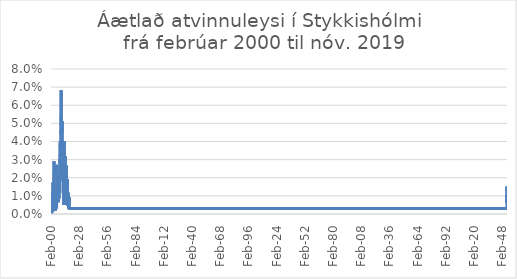
| Category | Áætlað atvinnuleysi |
|---|---|
| 2000-02-01 | 0.01 |
| 2000-03-01 | 0.01 |
| 2000-04-01 | 0.012 |
| 2000-05-01 | 0.003 |
| 2000-06-01 | 0.003 |
| 2000-07-01 | 0.001 |
| 2000-08-01 | 0.001 |
| 2000-09-01 | 0 |
| 2000-10-01 | 0 |
| 2000-11-01 | 0.001 |
| 2000-12-01 | 0.004 |
| 2001-01-01 | 0.003 |
| 2001-02-01 | 0.006 |
| 2001-03-01 | 0.004 |
| 2001-04-01 | 0.006 |
| 2001-05-01 | 0.004 |
| 2001-06-01 | 0.001 |
| 2001-07-01 | 0.003 |
| 2001-08-01 | 0.004 |
| 2001-09-01 | 0.003 |
| 2001-10-01 | 0.001 |
| 2001-11-01 | 0.006 |
| 2001-12-01 | 0.01 |
| 2002-01-01 | 0.017 |
| 2002-02-01 | 0.013 |
| 2002-03-01 | 0.012 |
| 2002-04-01 | 0.009 |
| 2002-05-01 | 0.006 |
| 2002-06-01 | 0.003 |
| 2002-07-01 | 0.003 |
| 2002-08-01 | 0.009 |
| 2002-09-01 | 0.01 |
| 2002-10-01 | 0.018 |
| 2002-11-01 | 0.019 |
| 2002-12-01 | 0.019 |
| 2003-01-01 | 0.026 |
| 2003-02-01 | 0.028 |
| 2003-03-01 | 0.029 |
| 2003-04-01 | 0.022 |
| 2003-05-01 | 0.016 |
| 2003-06-01 | 0.013 |
| 2003-07-01 | 0.005 |
| 2003-08-01 | 0.009 |
| 2003-09-01 | 0.006 |
| 2003-10-01 | 0.008 |
| 2003-11-01 | 0.003 |
| 2003-12-01 | 0.01 |
| 2004-01-01 | 0.015 |
| 2004-02-01 | 0.012 |
| 2004-03-01 | 0.012 |
| 2004-04-01 | 0.011 |
| 2004-05-01 | 0.007 |
| 2004-06-01 | 0.003 |
| 2004-07-01 | 0.002 |
| 2004-08-01 | 0.005 |
| 2004-09-01 | 0.005 |
| 2004-10-01 | 0.007 |
| 2004-11-01 | 0.003 |
| 2004-12-01 | 0.005 |
| 2005-01-01 | 0.007 |
| 2005-02-01 | 0.003 |
| 2005-03-01 | 0.007 |
| 2005-04-01 | 0.013 |
| 2005-05-01 | 0.007 |
| 2005-06-01 | 0.003 |
| 2005-07-01 | 0.005 |
| 2005-08-01 | 0.003 |
| 2005-09-01 | 0.005 |
| 2005-10-01 | 0.01 |
| 2005-11-01 | 0.013 |
| 2005-12-01 | 0.013 |
| 2006-01-01 | 0.027 |
| 2006-02-01 | 0.021 |
| 2006-03-01 | 0.019 |
| 2006-04-01 | 0.018 |
| 2006-05-01 | 0.011 |
| 2006-06-01 | 0.011 |
| 2006-07-01 | 0.011 |
| 2006-08-01 | 0.009 |
| 2006-09-01 | 0.011 |
| 2006-10-01 | 0.013 |
| 2006-11-01 | 0.01 |
| 2006-12-01 | 0.01 |
| 2007-01-01 | 0.011 |
| 2007-02-01 | 0.008 |
| 2007-03-01 | 0.008 |
| 2007-04-01 | 0.008 |
| 2007-05-01 | 0.008 |
| 2007-06-01 | 0.01 |
| 2007-07-01 | 0.008 |
| 2007-08-01 | 0.007 |
| 2007-09-01 | 0.01 |
| 2007-10-01 | 0.012 |
| 2007-11-01 | 0.012 |
| 2007-12-01 | 0.009 |
| 2008-01-01 | 0.01 |
| 2008-02-01 | 0.015 |
| 2008-03-01 | 0.012 |
| 2008-04-01 | 0.013 |
| 2008-05-01 | 0.014 |
| 2008-06-01 | 0.011 |
| 2008-07-01 | 0.015 |
| 2008-08-01 | 0.015 |
| 2008-09-01 | 0.011 |
| 2008-10-01 | 0.012 |
| 2008-11-01 | 0.022 |
| 2008-12-01 | 0.03 |
| 2009-01-01 | 0.028 |
| 2009-02-01 | 0.033 |
| 2009-03-01 | 0.04 |
| 2009-04-01 | 0.037 |
| 2009-05-01 | 0.034 |
| 2009-06-01 | 0.032 |
| 2009-07-01 | 0.026 |
| 2009-08-01 | 0.024 |
| 2009-09-01 | 0.023 |
| 2009-10-01 | 0.035 |
| 2009-11-01 | 0.046 |
| 2009-12-01 | 0.046 |
| 2010-01-01 | 0.044 |
| 2010-02-01 | 0.055 |
| 2010-03-01 | 0.068 |
| 2010-04-01 | 0.054 |
| 2010-05-01 | 0.037 |
| 2010-06-01 | 0.02 |
| 2010-07-01 | 0.023 |
| 2010-08-01 | 0.026 |
| 2010-09-01 | 0.03 |
| 2010-10-01 | 0.025 |
| 2010-11-01 | 0.03 |
| 2010-12-01 | 0.027 |
| 2011-01-01 | 0.041 |
| 2011-02-01 | 0.043 |
| 2011-03-01 | 0.051 |
| 2011-04-01 | 0.045 |
| 2011-05-01 | 0.028 |
| 2011-06-01 | 0.033 |
| 2011-07-01 | 0.035 |
| 2011-08-01 | 0.032 |
| 2011-09-01 | 0.019 |
| 2011-10-01 | 0.033 |
| 2011-11-01 | 0.03 |
| 2011-12-01 | 0.03 |
| 2012-01-01 | 0.024 |
| 2012-02-01 | 0.026 |
| 2012-03-01 | 0.027 |
| 2012-04-01 | 0.025 |
| 2012-05-01 | 0.013 |
| 2012-06-01 | 0.011 |
| 2012-07-01 | 0.01 |
| 2012-08-01 | 0.005 |
| 2012-09-01 | 0.011 |
| 2012-10-01 | 0.02 |
| 2012-11-01 | 0.027 |
| 2012-12-01 | 0.03 |
| 2013-01-01 | 0.035 |
| 2013-02-01 | 0.039 |
| 2013-03-01 | 0.04 |
| 2013-04-01 | 0.03 |
| 2013-05-01 | 0.017 |
| 2013-06-01 | 0.016 |
| 2013-07-01 | 0.02 |
| 2013-08-01 | 0.017 |
| 2013-09-01 | 0.013 |
| 2013-10-01 | 0.01 |
| 2013-11-01 | 0.01 |
| 2013-12-01 | 0.016 |
| 2014-01-01 | 0.023 |
| 2014-02-01 | 0.025 |
| 2014-03-01 | 0.032 |
| 2014-04-01 | 0.03 |
| 2014-05-01 | 0.018 |
| 2014-06-01 | 0.012 |
| 2014-07-01 | 0.01 |
| 2014-08-01 | 0.007 |
| 2014-09-01 | 0.005 |
| 2014-10-01 | 0.01 |
| 2014-11-01 | 0.012 |
| 2014-12-01 | 0.018 |
| 2015-01-01 | 0.025 |
| 2015-02-01 | 0.023 |
| 2015-03-01 | 0.027 |
| 2015-04-01 | 0.02 |
| 2015-05-01 | 0.016 |
| 2015-06-01 | 0.02 |
| 2015-07-01 | 0.022 |
| 2015-08-01 | 0.02 |
| 2015-09-01 | 0.014 |
| 2015-10-01 | 0.014 |
| 2015-11-01 | 0.016 |
| 2015-12-01 | 0.018 |
| 2016-01-01 | 0.014 |
| 2016-02-01 | 0.019 |
| 2016-03-01 | 0.017 |
| 2016-04-01 | 0.017 |
| 2016-05-01 | 0.017 |
| 2016-06-01 | 0.016 |
| 2016-07-01 | 0.019 |
| 2016-08-01 | 0.012 |
| 2016-09-01 | 0.004 |
| 2016-10-01 | 0.006 |
| 2016-11-01 | 0.01 |
| 2016-12-01 | 0.009 |
| 2017-01-01 | 0.012 |
| 2017-02-01 | 0.01 |
| 2017-03-01 | 0.007 |
| 2017-04-01 | 0.007 |
| 2017-05-01 | 0.007 |
| 2017-06-01 | 0.003 |
| 2017-07-01 | 0.003 |
| 2017-08-01 | 0.003 |
| 2017-09-01 | 0.003 |
| 2017-10-01 | 0.005 |
| 2017-11-01 | 0.008 |
| 2017-12-01 | 0.006 |
| 2018-01-01 | 0.006 |
| 2018-02-01 | 0.008 |
| 2018-03-01 | 0.009 |
| 2018-04-01 | 0.008 |
| 2018-05-01 | 0.008 |
| 2018-06-01 | 0.003 |
| 2018-07-01 | 0.003 |
| 201808.0 | 0.003 |
| 201809.0 | 0.003 |
| 201810.0 | 0.003 |
| 201811.0 | 0.003 |
| 201812.0 | 0.003 |
| 201901.0 | 0.006 |
| 201902.0 | 0.008 |
| 201903.0 | 0.009 |
| 201904.0 | 0.015 |
| 201905.0 | 0.012 |
| 201906.0 | 0.006 |
| 201907.0 | 0.011 |
| 201908.0 | 0.008 |
| 201909.0 | 0.008 |
| 201910.0 | 0.006 |
| 201911.0 | 0.009 |